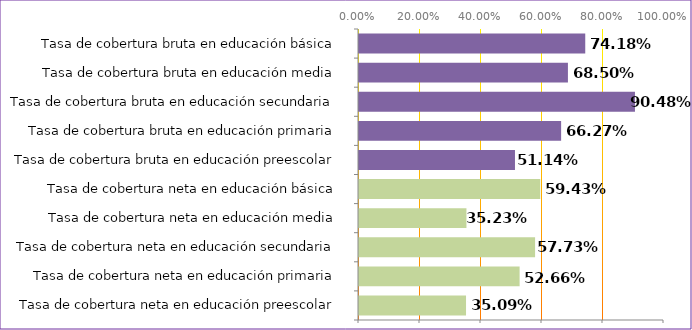
| Category | Series 0 |
|---|---|
| Tasa de cobertura neta en educación preescolar | 0.351 |
| Tasa de cobertura neta en educación primaria | 0.527 |
| Tasa de cobertura neta en educación secundaria | 0.577 |
| Tasa de cobertura neta en educación media | 0.352 |
| Tasa de cobertura neta en educación básica | 0.594 |
| Tasa de cobertura bruta en educación preescolar | 0.511 |
| Tasa de cobertura bruta en educación primaria | 0.663 |
| Tasa de cobertura bruta en educación secundaria | 0.905 |
| Tasa de cobertura bruta en educación media | 0.685 |
| Tasa de cobertura bruta en educación básica | 0.742 |